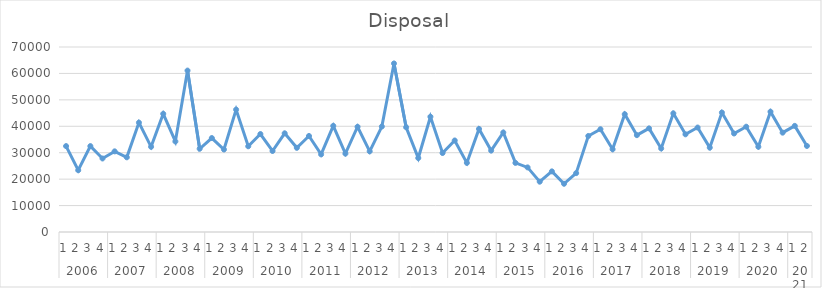
| Category | Disposal |
|---|---|
| 0 | 32506 |
| 1 | 23369 |
| 2 | 32494 |
| 3 | 27820 |
| 4 | 30515 |
| 5 | 28264 |
| 6 | 41387 |
| 7 | 32235 |
| 8 | 44716 |
| 9 | 34265 |
| 10 | 61075 |
| 11 | 31498 |
| 12 | 35552 |
| 13 | 31222 |
| 14 | 46309 |
| 15 | 32438 |
| 16 | 37067 |
| 17 | 30653 |
| 18 | 37342 |
| 19 | 31851 |
| 20 | 36332 |
| 21 | 29365 |
| 22 | 40160 |
| 23 | 29653 |
| 24 | 39823 |
| 25 | 30521 |
| 26 | 39904 |
| 27 | 63772 |
| 28 | 39636 |
| 29 | 27994 |
| 30 | 43617 |
| 31 | 29886 |
| 32 | 34627 |
| 33 | 26148 |
| 34 | 39003 |
| 35 | 30802 |
| 36 | 37656 |
| 37 | 26148 |
| 38 | 24443 |
| 39 | 19036 |
| 40 | 22937 |
| 41 | 18255 |
| 42 | 22273 |
| 43 | 36330.782 |
| 44 | 38891.949 |
| 45 | 31295.56 |
| 46 | 44572.227 |
| 47 | 36646.004 |
| 48 | 39207.171 |
| 49 | 31610.783 |
| 50 | 44887.45 |
| 51 | 36961.227 |
| 52 | 39522.394 |
| 53 | 31926.006 |
| 54 | 45202.672 |
| 55 | 37276.45 |
| 56 | 39837.617 |
| 57 | 32241.229 |
| 58 | 45517.895 |
| 59 | 37591.673 |
| 60 | 40152.84 |
| 61 | 32556.451 |